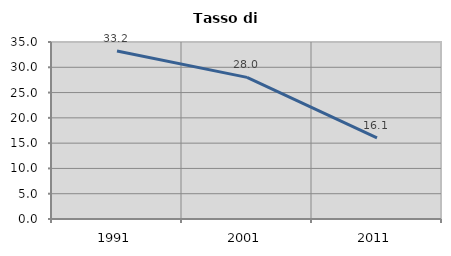
| Category | Tasso di disoccupazione   |
|---|---|
| 1991.0 | 33.233 |
| 2001.0 | 28 |
| 2011.0 | 16.055 |